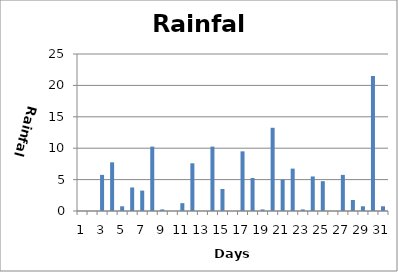
| Category | Series 0 |
|---|---|
| 0 | 0 |
| 1 | 0 |
| 2 | 5.75 |
| 3 | 7.75 |
| 4 | 0.75 |
| 5 | 3.75 |
| 6 | 3.25 |
| 7 | 10.25 |
| 8 | 0.25 |
| 9 | 0 |
| 10 | 1.25 |
| 11 | 7.6 |
| 12 | 0 |
| 13 | 10.25 |
| 14 | 3.5 |
| 15 | 0 |
| 16 | 9.5 |
| 17 | 5.25 |
| 18 | 0.25 |
| 19 | 13.25 |
| 20 | 5 |
| 21 | 6.75 |
| 22 | 0.25 |
| 23 | 5.5 |
| 24 | 4.75 |
| 25 | 0 |
| 26 | 5.75 |
| 27 | 1.75 |
| 28 | 0.75 |
| 29 | 21.5 |
| 30 | 0.75 |